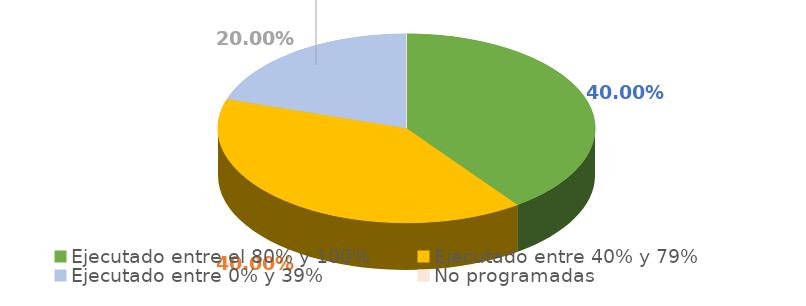
| Category | Series 0 |
|---|---|
| Ejecutado entre el 80% y 100% | 0.4 |
| Ejecutado entre 40% y 79% | 0.4 |
| Ejecutado entre 0% y 39% | 0.2 |
| No programadas | 0 |